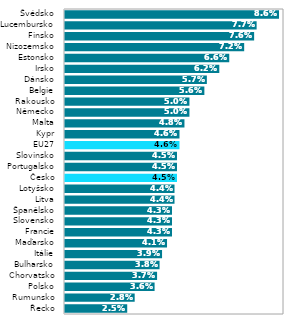
| Category | Series 0 |
|---|---|
| Řecko | 0.025 |
| Rumunsko | 0.028 |
| Polsko | 0.036 |
| Chorvatsko | 0.037 |
| Bulharsko | 0.038 |
| Itálie | 0.039 |
| Maďarsko | 0.041 |
| Francie | 0.043 |
| Slovensko | 0.043 |
| Španělsko | 0.043 |
| Litva | 0.044 |
| Lotyšsko | 0.044 |
| Česko | 0.045 |
| Portugalsko | 0.045 |
| Slovinsko | 0.045 |
| EU27 | 0.046 |
| Kypr | 0.046 |
| Malta | 0.048 |
| Německo | 0.05 |
| Rakousko | 0.05 |
| Belgie | 0.056 |
| Dánsko | 0.057 |
| Irsko | 0.062 |
| Estonsko | 0.066 |
| Nizozemsko | 0.072 |
| Finsko | 0.076 |
| Lucembursko | 0.077 |
| Švédsko | 0.086 |